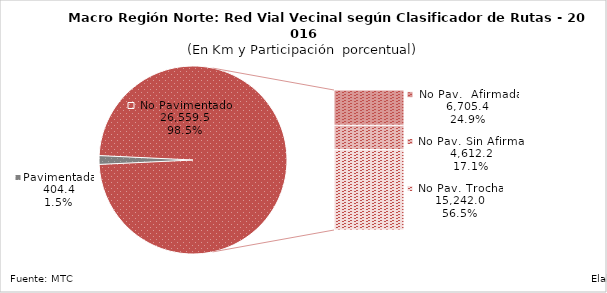
| Category | Series 0 |
|---|---|
| Pavimentada | 404.431 |
| No Pavimentada                   Afirmada | 6705.406 |
| No Pavimentada                   Sin Afirmar | 4612.171 |
| No Pavimentada                            Trocha | 15241.953 |